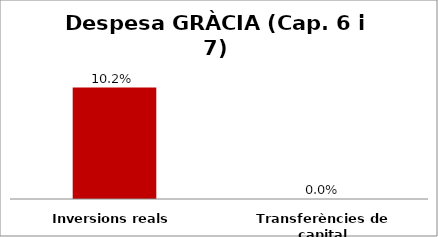
| Category | Series 0 |
|---|---|
| Inversions reals | 0.102 |
| Transferències de capital | 0 |